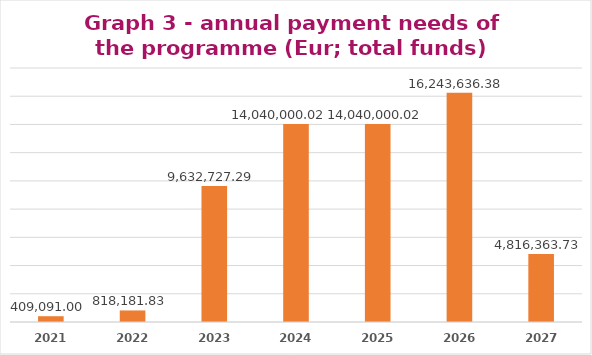
| Category | Series 1 |
|---|---|
| 2021.0 | 409091 |
| 2022.0 | 818181.833 |
| 2023.0 | 9632727.288 |
| 2024.0 | 14040000.015 |
| 2025.0 | 14040000.015 |
| 2026.0 | 16243636.379 |
| 2027.0 | 4816363.727 |